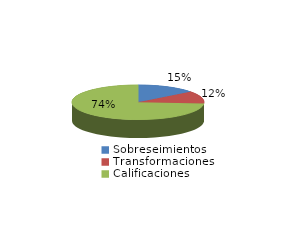
| Category | Series 0 |
|---|---|
| Sobreseimientos | 59 |
| Transformaciones | 47 |
| Calificaciones | 300 |